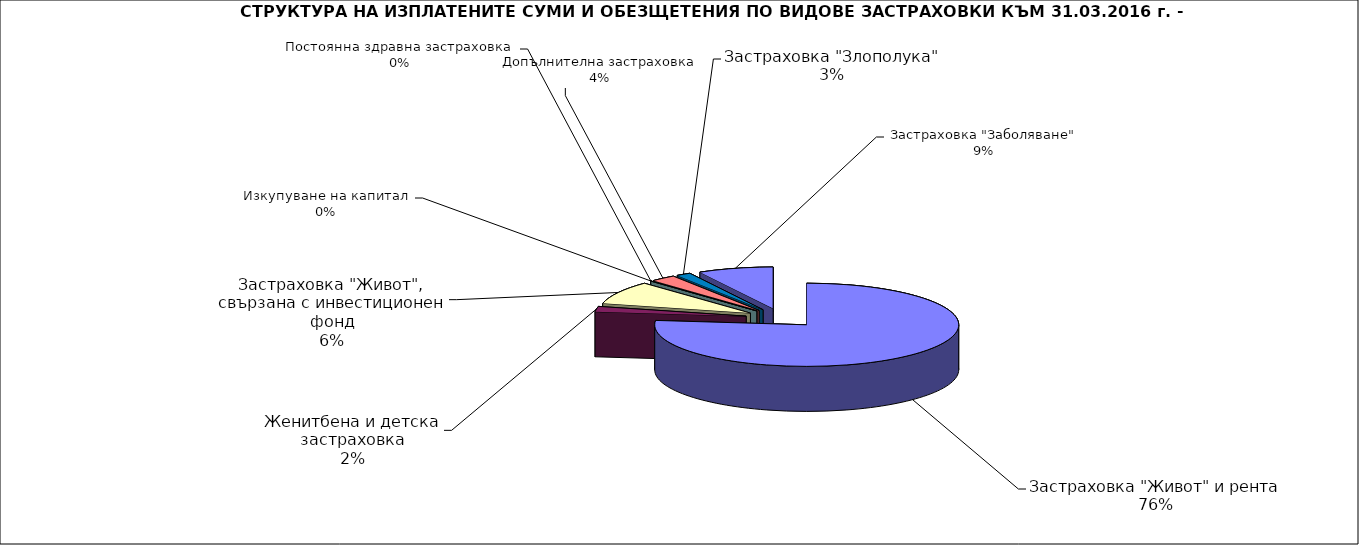
| Category | Series 0 |
|---|---|
| Застраховка "Живот" и рента | 29003714.942 |
| Женитбена и детска застраховка | 789424.688 |
| Застраховка "Живот", свързана с инвестиционен фонд | 3385521.89 |
| Постоянна здравна застраховка | 14534.62 |
| Изкупуване на капитал | 0 |
| Допълнителна застраховка | 1016107.085 |
| Застраховка "Злополука" | 587405.29 |
| Застраховка "Заболяване" | 3026673.44 |